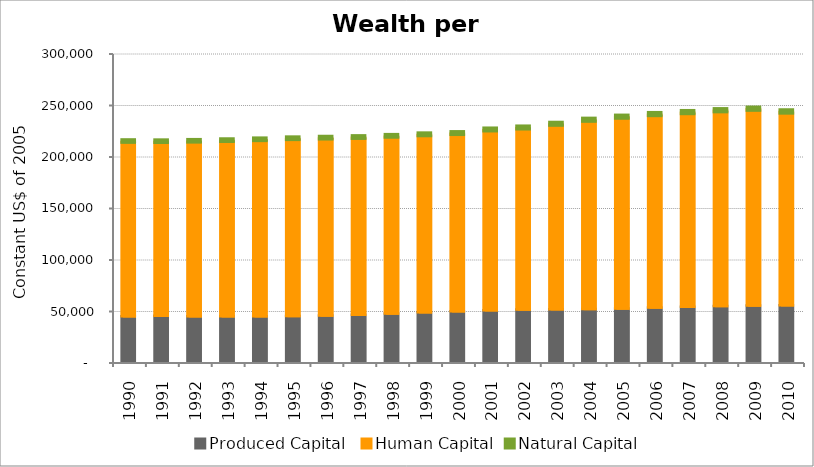
| Category | Produced Capital  | Human Capital | Natural Capital |
|---|---|---|---|
| 1990.0 | 44175.387 | 169227.929 | 1798.933 |
| 1991.0 | 44698.608 | 168579.653 | 1774.106 |
| 1992.0 | 44124.427 | 169535.529 | 1747.989 |
| 1993.0 | 44054.148 | 170254.576 | 1722.165 |
| 1994.0 | 44151.761 | 170998.873 | 1698.129 |
| 1995.0 | 44526.268 | 171655.986 | 1672.549 |
| 1996.0 | 44902.549 | 171848.485 | 1650.268 |
| 1997.0 | 45678.408 | 171682.473 | 1629.227 |
| 1998.0 | 46768.105 | 171777.415 | 1599.357 |
| 1999.0 | 48154.872 | 171907.415 | 1504.473 |
| 2000.0 | 49080.475 | 172215.287 | 1476.66 |
| 2001.0 | 50006.816 | 174790.126 | 1452.603 |
| 2002.0 | 50765.163 | 175986.278 | 1371.676 |
| 2003.0 | 50858.304 | 179512.857 | 1351.926 |
| 2004.0 | 51305.88 | 183036.014 | 1271.886 |
| 2005.0 | 51783.062 | 185530.83 | 1252.524 |
| 2006.0 | 52744.145 | 187109.196 | 1232.791 |
| 2007.0 | 53395.864 | 188386.96 | 1212.39 |
| 2008.0 | 54129.858 | 189488.441 | 1191.566 |
| 2009.0 | 54529.162 | 190575.702 | 1176.66 |
| 2010.0 | 54916.448 | 187563.997 | 1039.436 |